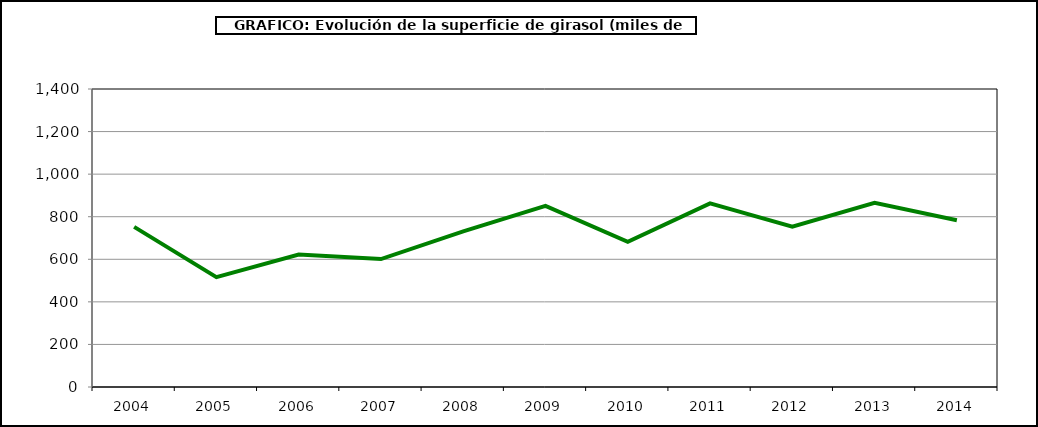
| Category | Superficie |
|---|---|
| 2004.0 | 752.175 |
| 2005.0 | 516.16 |
| 2006.0 | 622.494 |
| 2007.0 | 600.866 |
| 2008.0 | 730.819 |
| 2009.0 | 851.12 |
| 2010.0 | 682.522 |
| 2011.0 | 862.869 |
| 2012.0 | 753.015 |
| 2013.0 | 865.564 |
| 2014.0 | 783.425 |